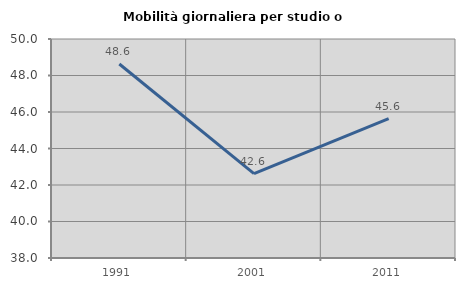
| Category | Mobilità giornaliera per studio o lavoro |
|---|---|
| 1991.0 | 48.628 |
| 2001.0 | 42.621 |
| 2011.0 | 45.639 |